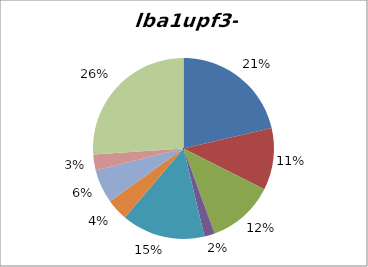
| Category | Series 0 |
|---|---|
| protein metabolism | 413 |
| misc | 214 |
| RNA | 232 |
| DNA | 36 |
| metabolism | 289 |
| signalling | 75 |
| cell division and development | 116 |
| stress | 55 |
| not assigned | 504 |